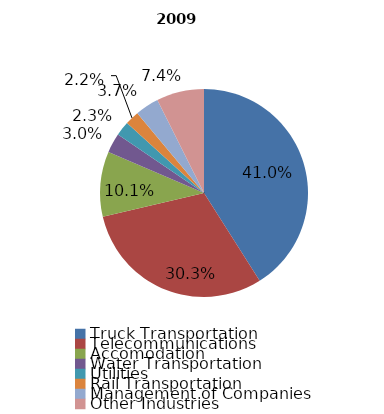
| Category | 2009 |
|---|---|
| Truck Transportation | 1314 |
| Telecommunications | 971 |
| Accomodation | 325 |
| Water Transportation | 97 |
| Utilities | 72 |
| Rail Transportation | 70 |
| Management of Companies | 118 |
| Other Industries | 237 |